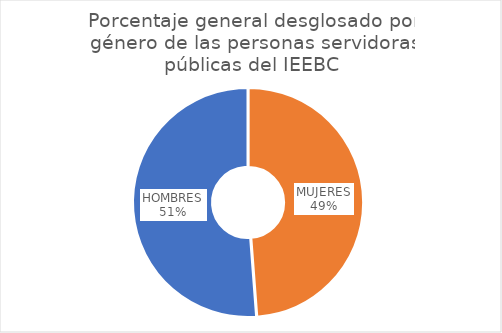
| Category | Series 0 |
|---|---|
| MUJERES | 48.8 |
| HOMBRES | 51.2 |